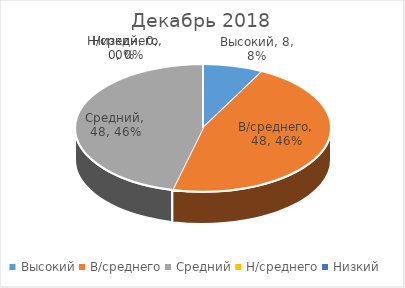
| Category | Декабрь 2018 |
|---|---|
| Высокий | 8 |
| В/среднего | 48 |
| Средний | 48 |
| Н/среднего | 0 |
| Низкий | 0 |